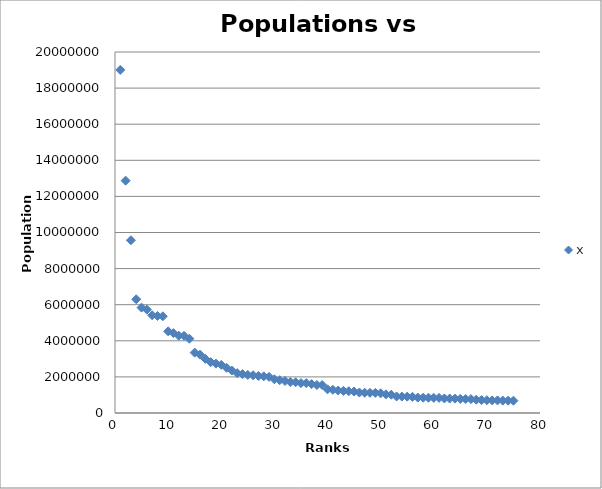
| Category | x |
|---|---|
| 1.0 | 19006798 |
| 2.0 | 12872808 |
| 3.0 | 9569624 |
| 4.0 | 6300006 |
| 5.0 | 5838471 |
| 6.0 | 5728143 |
| 7.0 | 5414772 |
| 8.0 | 5376285 |
| 9.0 | 5358130 |
| 10.0 | 4522858 |
| 11.0 | 4425110 |
| 12.0 | 4281899 |
| 13.0 | 4274531 |
| 14.0 | 4115871 |
| 15.0 | 3344813 |
| 16.0 | 3229878 |
| 17.0 | 3001072 |
| 18.0 | 2816710 |
| 19.0 | 2733761 |
| 20.0 | 2667117 |
| 21.0 | 2506626 |
| 22.0 | 2351192 |
| 23.0 | 2207462 |
| 24.0 | 2155137 |
| 25.0 | 2109832 |
| 26.0 | 2088291 |
| 27.0 | 2054574 |
| 28.0 | 2031445 |
| 29.0 | 2002047 |
| 30.0 | 1865746 |
| 31.0 | 1819198 |
| 32.0 | 1773120 |
| 33.0 | 1715459 |
| 34.0 | 1701799 |
| 35.0 | 1658292 |
| 36.0 | 1652602 |
| 37.0 | 1600611 |
| 38.0 | 1550733 |
| 39.0 | 1549308 |
| 40.0 | 1313228 |
| 41.0 | 1285732 |
| 42.0 | 1244696 |
| 43.0 | 1225626 |
| 44.0 | 1206142 |
| 45.0 | 1190512 |
| 46.0 | 1134029 |
| 47.0 | 1124309 |
| 48.0 | 1117608 |
| 49.0 | 1115692 |
| 50.0 | 1088765 |
| 51.0 | 1034090 |
| 52.0 | 1012018 |
| 53.0 | 916079 |
| 54.0 | 909153 |
| 55.0 | 905034 |
| 56.0 | 895030 |
| 57.0 | 853919 |
| 58.0 | 846101 |
| 59.0 | 845913 |
| 60.0 | 837925 |
| 61.0 | 836544 |
| 62.0 | 808210 |
| 63.0 | 800458 |
| 64.0 | 797740 |
| 65.0 | 781352 |
| 66.0 | 776742 |
| 67.0 | 770037 |
| 68.0 | 734669 |
| 69.0 | 716030 |
| 70.0 | 710514 |
| 71.0 | 699356 |
| 72.0 | 698497 |
| 73.0 | 687181 |
| 74.0 | 682657 |
| 75.0 | 681525 |